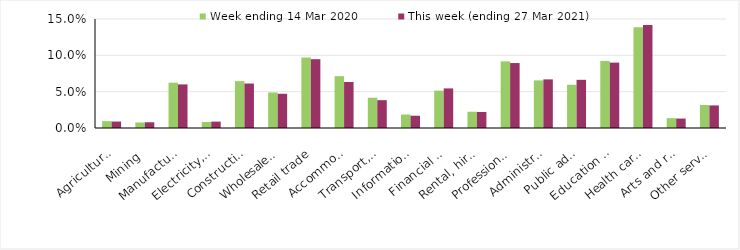
| Category | Week ending 14 Mar 2020 | This week (ending 27 Mar 2021) |
|---|---|---|
| Agriculture, forestry and fishing | 0.009 | 0.009 |
| Mining | 0.008 | 0.008 |
| Manufacturing | 0.062 | 0.06 |
| Electricity, gas, water and waste services | 0.008 | 0.009 |
| Construction | 0.064 | 0.061 |
| Wholesale trade | 0.049 | 0.047 |
| Retail trade | 0.097 | 0.095 |
| Accommodation and food services | 0.071 | 0.063 |
| Transport, postal and warehousing | 0.042 | 0.038 |
| Information media and telecommunications | 0.019 | 0.017 |
| Financial and insurance services | 0.051 | 0.054 |
| Rental, hiring and real estate services | 0.022 | 0.022 |
| Professional, scientific and technical services | 0.092 | 0.089 |
| Administrative and support services | 0.066 | 0.067 |
| Public administration and safety | 0.06 | 0.066 |
| Education and training | 0.092 | 0.09 |
| Health care and social assistance | 0.138 | 0.142 |
| Arts and recreation services | 0.014 | 0.013 |
| Other services | 0.032 | 0.031 |